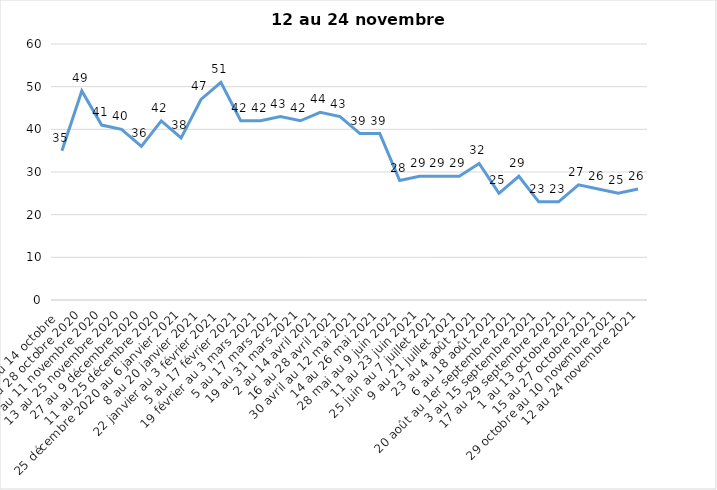
| Category | Toujours aux trois mesures |
|---|---|
| 2 au 14 octobre  | 35 |
| 16 au 28 octobre 2020 | 49 |
| 30 octobre au 11 novembre 2020 | 41 |
| 13 au 25 novembre 2020 | 40 |
| 27 au 9 décembre 2020 | 36 |
| 11 au 25 décembre 2020 | 42 |
| 25 décembre 2020 au 6 janvier 2021 | 38 |
| 8 au 20 janvier 2021 | 47 |
| 22 janvier au 3 février 2021 | 51 |
| 5 au 17 février 2021 | 42 |
| 19 février au 3 mars 2021 | 42 |
| 5 au 17 mars 2021 | 43 |
| 19 au 31 mars 2021 | 42 |
| 2 au 14 avril 2021 | 44 |
| 16 au 28 avril 2021 | 43 |
| 30 avril au 12 mai 2021 | 39 |
| 14 au 26 mai 2021 | 39 |
| 28 mai au 9 juin 2021 | 28 |
| 11 au 23 juin 2021 | 29 |
| 25 juin au 7 juillet 2021 | 29 |
| 9 au 21 juillet 2021 | 29 |
| 23 au 4 août 2021 | 32 |
| 6 au 18 août 2021 | 25 |
| 20 août au 1er septembre 2021 | 29 |
| 3 au 15 septembre 2021 | 23 |
| 17 au 29 septembre 2021 | 23 |
| 1 au 13 octobre 2021 | 27 |
| 15 au 27 octobre 2021 | 26 |
| 29 octobre au 10 novembre 2021 | 25 |
| 12 au 24 novembre 2021 | 26 |